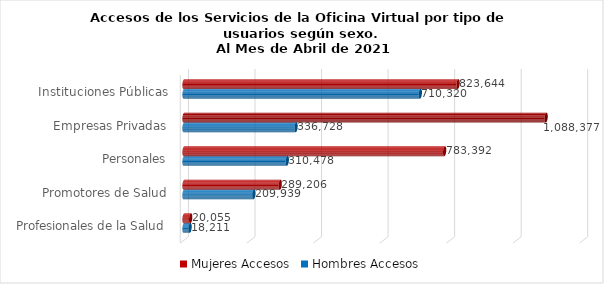
| Category | Mujeres | Hombres |
|---|---|---|
| Instituciones Públicas | 823644 | 710320 |
| Empresas Privadas | 1088377 | 336728 |
| Personales | 783392 | 310478 |
| Promotores de Salud | 289206 | 209939 |
| Profesionales de la Salud | 20055 | 18211 |